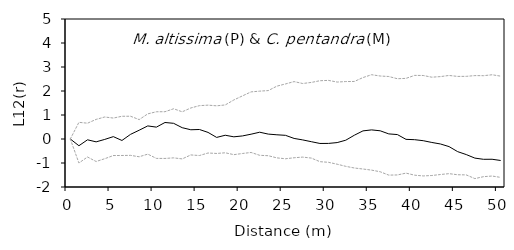
| Category | L12(r) | E12- | E12+ |
|---|---|---|---|
| 0.0 | 0 | 0 | 0 |
| 1.0 | -0.28 | -1 | 0.694 |
| 2.0 | -0.034 | -0.75 | 0.659 |
| 3.0 | -0.119 | -0.938 | 0.817 |
| 4.0 | -0.017 | -0.821 | 0.917 |
| 5.0 | 0.099 | -0.689 | 0.872 |
| 6.0 | -0.062 | -0.687 | 0.947 |
| 7.0 | 0.194 | -0.682 | 0.948 |
| 8.0 | 0.366 | -0.74 | 0.809 |
| 9.0 | 0.545 | -0.63 | 1.047 |
| 10.0 | 0.495 | -0.808 | 1.135 |
| 11.0 | 0.688 | -0.81 | 1.137 |
| 12.0 | 0.654 | -0.786 | 1.26 |
| 13.0 | 0.471 | -0.829 | 1.134 |
| 14.0 | 0.385 | -0.664 | 1.292 |
| 15.0 | 0.396 | -0.689 | 1.389 |
| 16.0 | 0.275 | -0.583 | 1.41 |
| 17.0 | 0.066 | -0.602 | 1.383 |
| 18.0 | 0.157 | -0.575 | 1.419 |
| 19.0 | 0.091 | -0.652 | 1.627 |
| 20.0 | 0.128 | -0.604 | 1.796 |
| 21.0 | 0.2 | -0.561 | 1.963 |
| 22.0 | 0.283 | -0.68 | 1.994 |
| 23.0 | 0.204 | -0.696 | 2.018 |
| 24.0 | 0.175 | -0.787 | 2.202 |
| 25.0 | 0.153 | -0.823 | 2.294 |
| 26.0 | 0.024 | -0.782 | 2.392 |
| 27.0 | -0.038 | -0.755 | 2.312 |
| 28.0 | -0.112 | -0.795 | 2.357 |
| 29.0 | -0.186 | -0.945 | 2.428 |
| 30.0 | -0.184 | -0.972 | 2.442 |
| 31.0 | -0.149 | -1.05 | 2.372 |
| 32.0 | -0.05 | -1.139 | 2.394 |
| 33.0 | 0.158 | -1.208 | 2.397 |
| 34.0 | 0.338 | -1.251 | 2.56 |
| 35.0 | 0.379 | -1.297 | 2.678 |
| 36.0 | 0.342 | -1.365 | 2.624 |
| 37.0 | 0.212 | -1.505 | 2.604 |
| 38.0 | 0.185 | -1.498 | 2.511 |
| 39.0 | -0.015 | -1.422 | 2.526 |
| 40.0 | -0.028 | -1.507 | 2.65 |
| 41.0 | -0.071 | -1.539 | 2.646 |
| 42.0 | -0.144 | -1.521 | 2.575 |
| 43.0 | -0.207 | -1.48 | 2.6 |
| 44.0 | -0.317 | -1.444 | 2.648 |
| 45.0 | -0.527 | -1.49 | 2.608 |
| 46.0 | -0.649 | -1.496 | 2.611 |
| 47.0 | -0.796 | -1.65 | 2.642 |
| 48.0 | -0.846 | -1.57 | 2.638 |
| 49.0 | -0.844 | -1.543 | 2.676 |
| 50.0 | -0.896 | -1.6 | 2.619 |